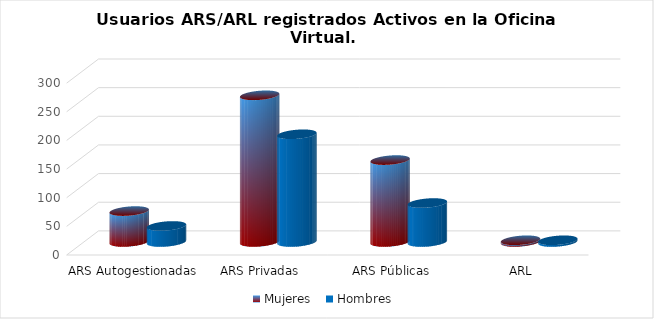
| Category | Mujeres | Hombres |
|---|---|---|
| ARS Autogestionadas | 54 | 28 |
| ARS Privadas | 256 | 188 |
| ARS Públicas | 143 | 68 |
| ARL | 3 | 3 |